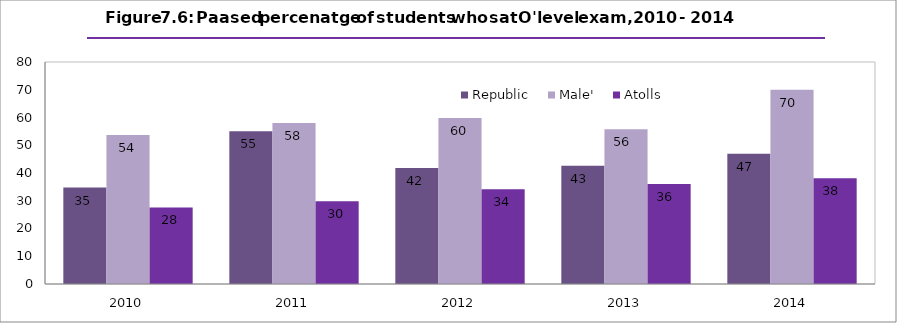
| Category | Republic | Male' | Atolls |
|---|---|---|---|
| 2010.0 | 34.74 | 53.696 | 27.596 |
| 2011.0 | 55.006 | 57.991 | 29.784 |
| 2012.0 | 41.822 | 59.811 | 34.128 |
| 2013.0 | 42.61 | 55.792 | 36.042 |
| 2014.0 | 46.892 | 70 | 38.096 |